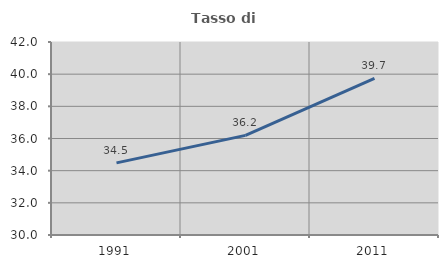
| Category | Tasso di occupazione   |
|---|---|
| 1991.0 | 34.483 |
| 2001.0 | 36.193 |
| 2011.0 | 39.741 |